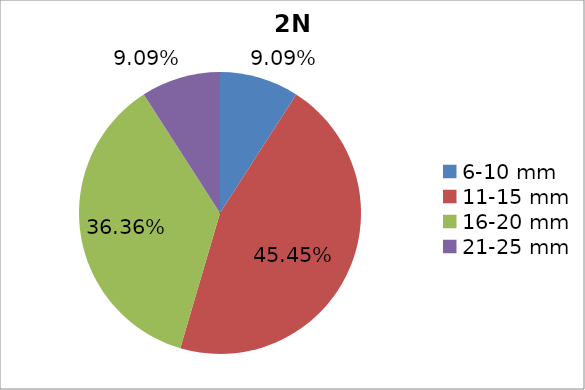
| Category | Series 0 |
|---|---|
| 6-10 mm | 0.091 |
| 11-15 mm | 0.454 |
| 16-20 mm | 0.364 |
| 21-25 mm | 0.091 |